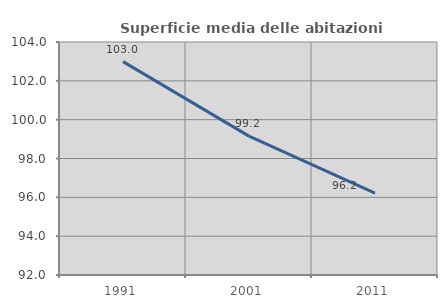
| Category | Superficie media delle abitazioni occupate |
|---|---|
| 1991.0 | 102.988 |
| 2001.0 | 99.153 |
| 2011.0 | 96.215 |